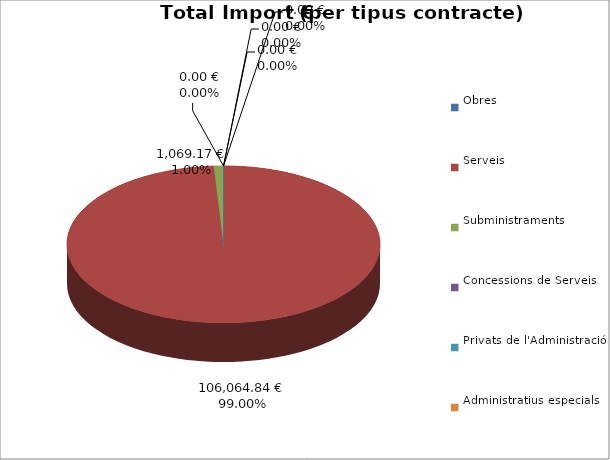
| Category | Total preu
(amb IVA) |
|---|---|
| Obres | 0 |
| Serveis | 106064.84 |
| Subministraments | 1069.17 |
| Concessions de Serveis | 0 |
| Privats de l'Administració | 0 |
| Administratius especials | 0 |